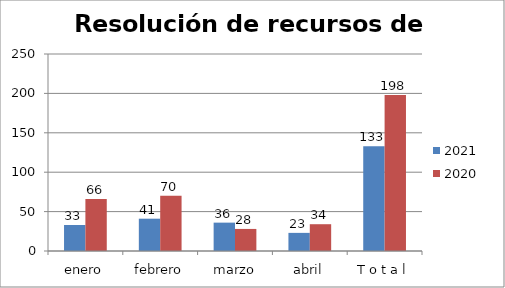
| Category | 2021 | 2020 |
|---|---|---|
| enero | 33 | 66 |
| febrero | 41 | 70 |
| marzo | 36 | 28 |
| abril | 23 | 34 |
| T o t a l | 133 | 198 |